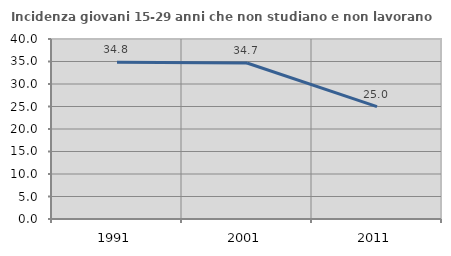
| Category | Incidenza giovani 15-29 anni che non studiano e non lavorano  |
|---|---|
| 1991.0 | 34.831 |
| 2001.0 | 34.668 |
| 2011.0 | 24.963 |